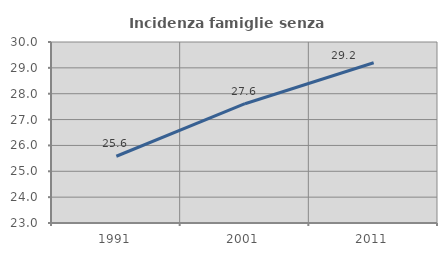
| Category | Incidenza famiglie senza nuclei |
|---|---|
| 1991.0 | 25.581 |
| 2001.0 | 27.613 |
| 2011.0 | 29.199 |